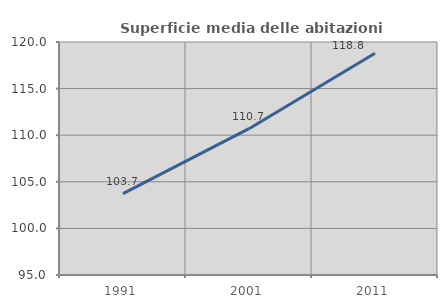
| Category | Superficie media delle abitazioni occupate |
|---|---|
| 1991.0 | 103.723 |
| 2001.0 | 110.701 |
| 2011.0 | 118.801 |